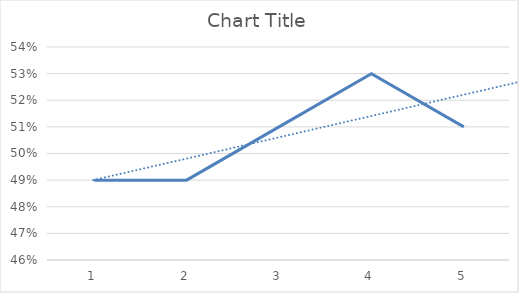
| Category | Series 0 |
|---|---|
| 0 | 0.49 |
| 1 | 0.49 |
| 2 | 0.51 |
| 3 | 0.53 |
| 4 | 0.51 |